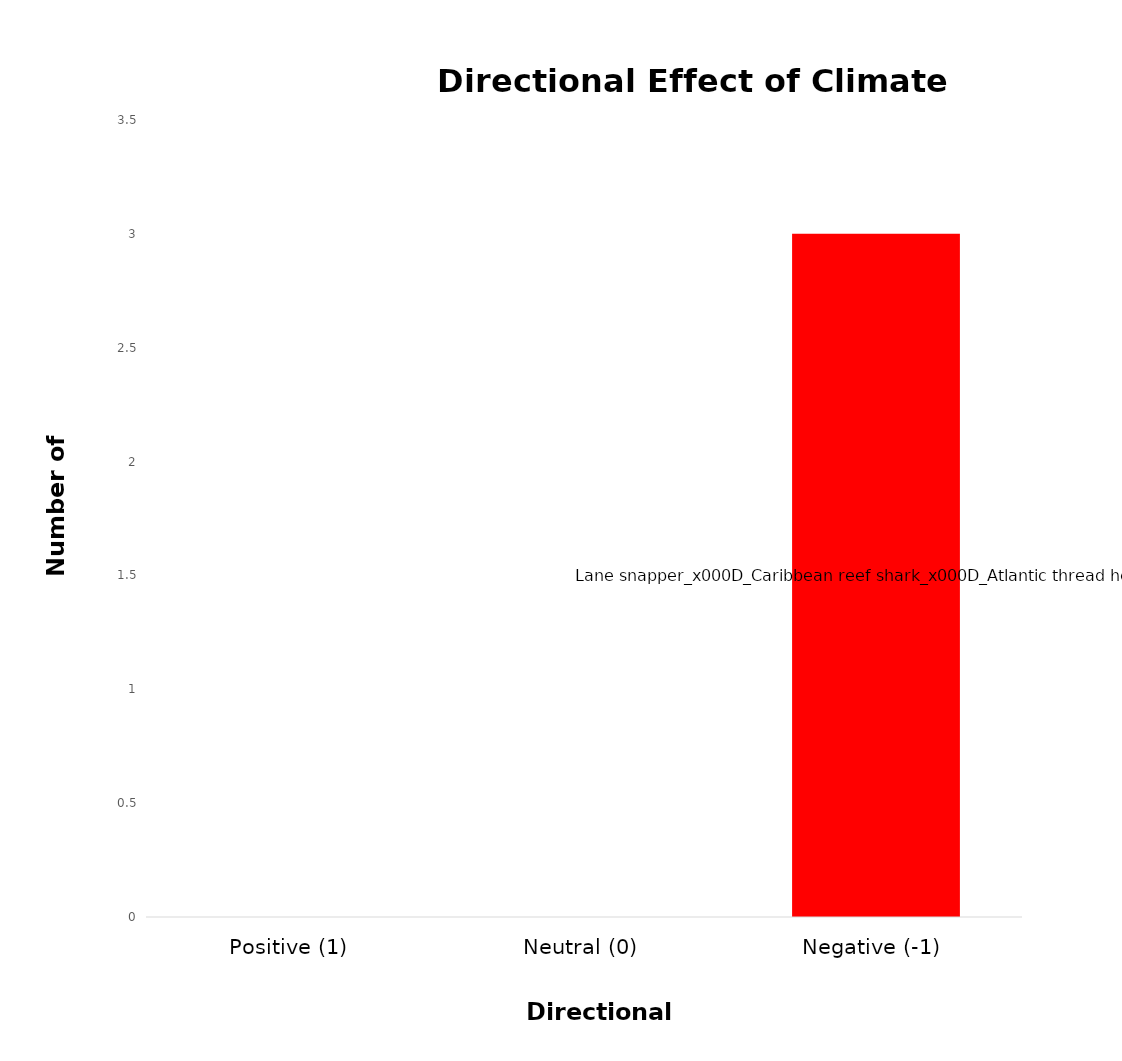
| Category | Series 0 |
|---|---|
| 0 | 0 |
| 1 | 0 |
| 2 | 3 |